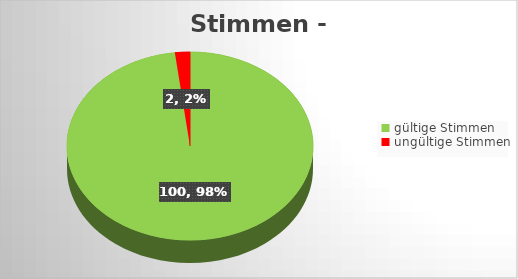
| Category | Series 0 |
|---|---|
| gültige Stimmen | 100 |
| ungültige Stimmen | 2 |